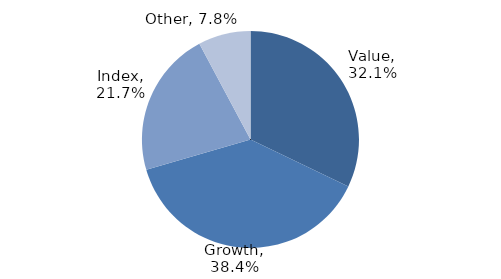
| Category | Investment Style |
|---|---|
| Value | 0.321 |
| Growth | 0.384 |
| Index | 0.217 |
| Other | 0.078 |